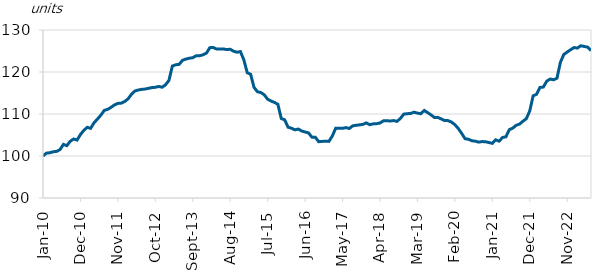
| Category | Index |
|---|---|
| 2010-01-01 | 100 |
| 2010-02-01 | 100.68 |
| 2010-03-01 | 100.776 |
| 2010-04-01 | 101.007 |
| 2010-05-01 | 101.102 |
| 2010-06-01 | 101.524 |
| 2010-07-01 | 102.762 |
| 2010-08-01 | 102.463 |
| 2010-09-01 | 103.497 |
| 2010-10-01 | 104.055 |
| 2010-11-01 | 103.796 |
| 2010-12-01 | 105.103 |
| 2011-01-01 | 106.123 |
| 2011-02-01 | 106.831 |
| 2011-03-01 | 106.586 |
| 2011-04-01 | 107.933 |
| 2011-05-01 | 108.79 |
| 2011-06-01 | 109.729 |
| 2011-07-01 | 110.859 |
| 2011-08-01 | 111.104 |
| 2011-09-01 | 111.593 |
| 2011-10-01 | 112.165 |
| 2011-11-01 | 112.519 |
| 2011-12-01 | 112.587 |
| 2012-01-01 | 112.968 |
| 2012-02-01 | 113.621 |
| 2012-03-01 | 114.709 |
| 2012-04-01 | 115.471 |
| 2012-05-01 | 115.716 |
| 2012-06-01 | 115.866 |
| 2012-07-01 | 115.934 |
| 2012-08-01 | 116.125 |
| 2012-09-01 | 116.288 |
| 2012-10-01 | 116.356 |
| 2012-11-01 | 116.56 |
| 2012-12-01 | 116.37 |
| 2013-01-01 | 116.955 |
| 2013-02-01 | 117.989 |
| 2013-03-01 | 121.418 |
| 2013-04-01 | 121.717 |
| 2013-05-01 | 121.826 |
| 2013-06-01 | 122.792 |
| 2013-07-01 | 123.078 |
| 2013-08-01 | 123.282 |
| 2013-09-01 | 123.405 |
| 2013-10-01 | 123.867 |
| 2013-11-01 | 123.881 |
| 2013-12-01 | 124.085 |
| 2014-01-01 | 124.48 |
| 2014-02-01 | 125.786 |
| 2014-03-01 | 125.84 |
| 2014-04-01 | 125.473 |
| 2014-05-01 | 125.446 |
| 2014-06-01 | 125.486 |
| 2014-07-01 | 125.337 |
| 2014-08-01 | 125.418 |
| 2014-09-01 | 124.942 |
| 2014-10-01 | 124.711 |
| 2014-11-01 | 124.861 |
| 2014-12-01 | 122.915 |
| 2015-01-01 | 119.839 |
| 2015-02-01 | 119.458 |
| 2015-03-01 | 116.342 |
| 2015-04-01 | 115.295 |
| 2015-05-01 | 115.118 |
| 2015-06-01 | 114.573 |
| 2015-07-01 | 113.512 |
| 2015-08-01 | 113.09 |
| 2015-09-01 | 112.75 |
| 2015-10-01 | 112.328 |
| 2015-11-01 | 108.926 |
| 2015-12-01 | 108.613 |
| 2016-01-01 | 106.858 |
| 2016-02-01 | 106.613 |
| 2016-03-01 | 106.232 |
| 2016-04-01 | 106.423 |
| 2016-05-01 | 105.946 |
| 2016-06-01 | 105.715 |
| 2016-07-01 | 105.497 |
| 2016-08-01 | 104.49 |
| 2016-09-01 | 104.463 |
| 2016-10-01 | 103.415 |
| 2016-11-01 | 103.47 |
| 2016-12-01 | 103.538 |
| 2017-01-01 | 103.483 |
| 2017-02-01 | 104.763 |
| 2017-03-01 | 106.627 |
| 2017-04-01 | 106.586 |
| 2017-05-01 | 106.586 |
| 2017-06-01 | 106.763 |
| 2017-07-01 | 106.559 |
| 2017-08-01 | 107.185 |
| 2017-09-01 | 107.307 |
| 2017-10-01 | 107.416 |
| 2017-11-01 | 107.538 |
| 2017-12-01 | 107.879 |
| 2018-01-01 | 107.457 |
| 2018-02-01 | 107.647 |
| 2018-03-01 | 107.688 |
| 2018-04-01 | 107.851 |
| 2018-05-01 | 108.368 |
| 2018-06-01 | 108.409 |
| 2018-07-01 | 108.328 |
| 2018-08-01 | 108.437 |
| 2018-09-01 | 108.246 |
| 2018-10-01 | 108.94 |
| 2018-11-01 | 109.974 |
| 2018-12-01 | 110.069 |
| 2019-01-01 | 110.124 |
| 2019-02-01 | 110.437 |
| 2019-03-01 | 110.219 |
| 2019-04-01 | 110.056 |
| 2019-05-01 | 110.845 |
| 2019-06-01 | 110.328 |
| 2019-07-01 | 109.784 |
| 2019-08-01 | 109.171 |
| 2019-09-01 | 109.199 |
| 2019-10-01 | 108.818 |
| 2019-11-01 | 108.437 |
| 2019-12-01 | 108.423 |
| 2020-01-01 | 108.083 |
| 2020-02-01 | 107.47 |
| 2020-03-01 | 106.559 |
| 2020-04-01 | 105.375 |
| 2020-05-01 | 104.123 |
| 2020-06-01 | 103.987 |
| 2020-07-01 | 103.633 |
| 2020-08-01 | 103.524 |
| 2020-09-01 | 103.307 |
| 2020-10-01 | 103.429 |
| 2020-11-01 | 103.402 |
| 2020-12-01 | 103.211 |
| 2021-01-01 | 103.007 |
| 2021-02-01 | 103.851 |
| 2021-03-01 | 103.524 |
| 2021-04-01 | 104.409 |
| 2021-05-01 | 104.572 |
| 2021-06-01 | 106.273 |
| 2021-07-01 | 106.631 |
| 2021-08-01 | 107.307 |
| 2021-09-01 | 107.592 |
| 2021-10-01 | 108.277 |
| 2021-11-01 | 108.893 |
| 2021-12-01 | 110.727 |
| 2022-01-01 | 114.32 |
| 2022-02-01 | 114.687 |
| 2022-03-01 | 116.312 |
| 2022-04-01 | 116.422 |
| 2022-05-01 | 117.82 |
| 2022-06-01 | 118.332 |
| 2022-07-01 | 118.143 |
| 2022-08-01 | 118.511 |
| 2022-09-01 | 122.287 |
| 2022-10-01 | 124.165 |
| 2022-11-01 | 124.75 |
| 2022-12-01 | 125.294 |
| 2023-01-01 | 125.823 |
| 2023-02-01 | 125.694 |
| 2023-03-01 | 126.255 |
| 2023-04-01 | 126.077 |
| 2023-05-01 | 125.924 |
| 2023-06-01 | 125.106 |